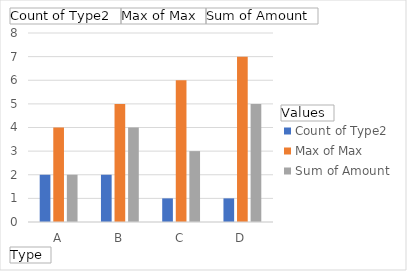
| Category | Count of Type2 | Max of Max | Sum of Amount |
|---|---|---|---|
| A | 2 | 4 | 2 |
| B | 2 | 5 | 4 |
| C | 1 | 6 | 3 |
| D | 1 | 7 | 5 |